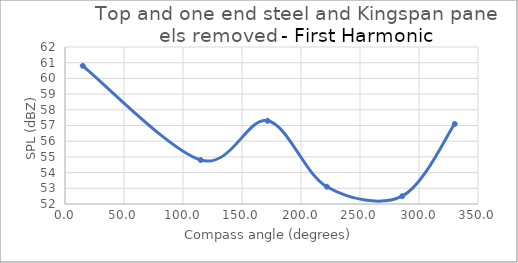
| Category | Series 0 |
|---|---|
| 15.06445125542554 | 60.8 |
| 115.00449447818254 | 54.8 |
| 171.7068171198818 | 57.3 |
| 221.8691292075067 | 53.1 |
| 285.7828166838848 | 52.5 |
| 330.28010595813004 | 57.1 |